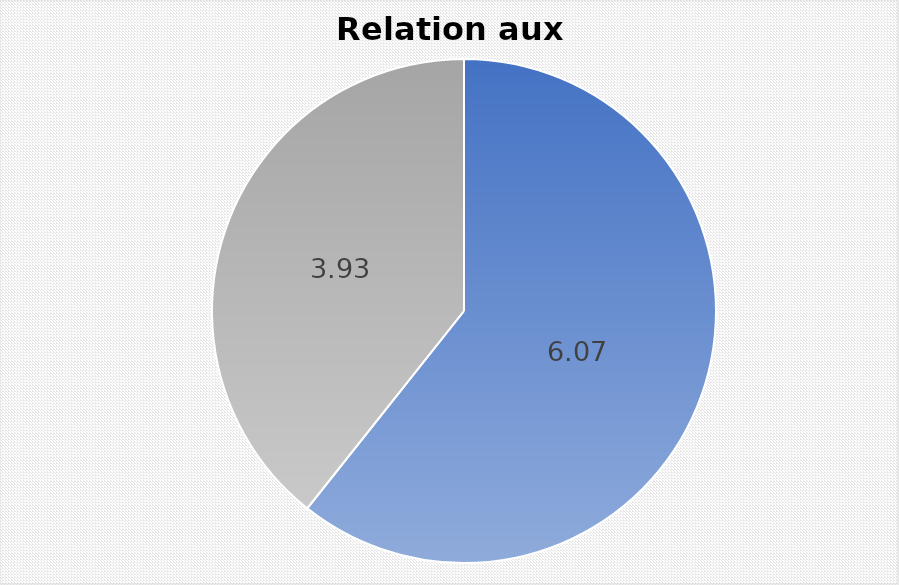
| Category | Series 0 |
|---|---|
| 0 | 6.068 |
| 1 | 3.932 |